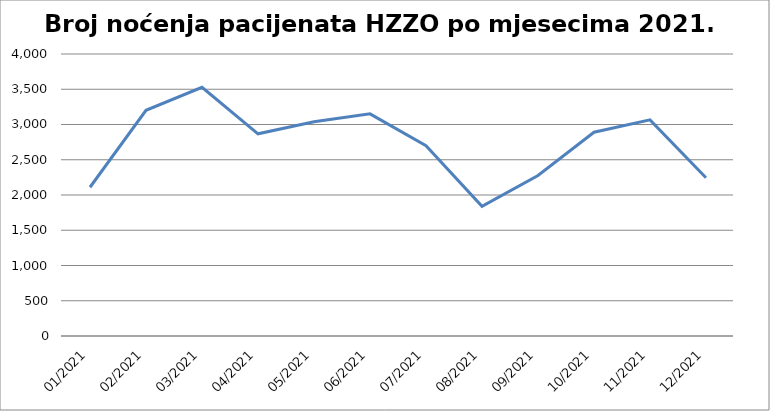
| Category | Series 0 |
|---|---|
| 01/2021 | 2110 |
| 02/2021 | 3202 |
| 03/2021 | 3527 |
| 04/2021 | 2868 |
| 05/2021 | 3040 |
| 06/2021 | 3151 |
| 07/2021 | 2698 |
| 08/2021 | 1839 |
| 09/2021 | 2277 |
| 10/2021 | 2890 |
| 11/2021 | 3066 |
| 12/2021 | 2244 |